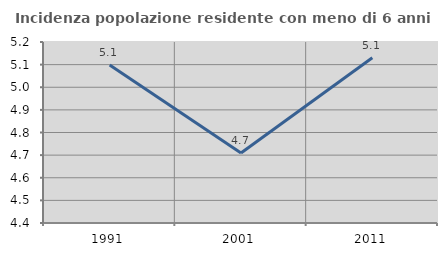
| Category | Incidenza popolazione residente con meno di 6 anni |
|---|---|
| 1991.0 | 5.098 |
| 2001.0 | 4.709 |
| 2011.0 | 5.13 |